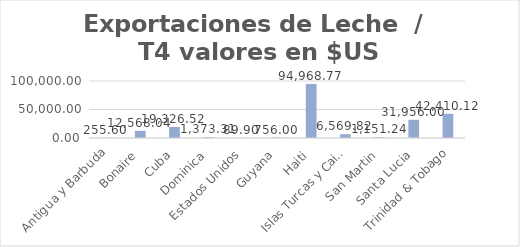
| Category | Valor US  |
|---|---|
| Antigua y Barbuda | 255.6 |
| Bonaire | 12568.04 |
| Cuba | 19326.52 |
| Dominica | 1373.31 |
| Estados Unidos | 89.9 |
| Guyana | 756 |
| Haiti | 94968.77 |
| Islas Turcas y Caicos | 6569.82 |
| San Martin | 1151.24 |
| Santa Lucia | 31956 |
| Trinidad & Tobago | 42410.12 |